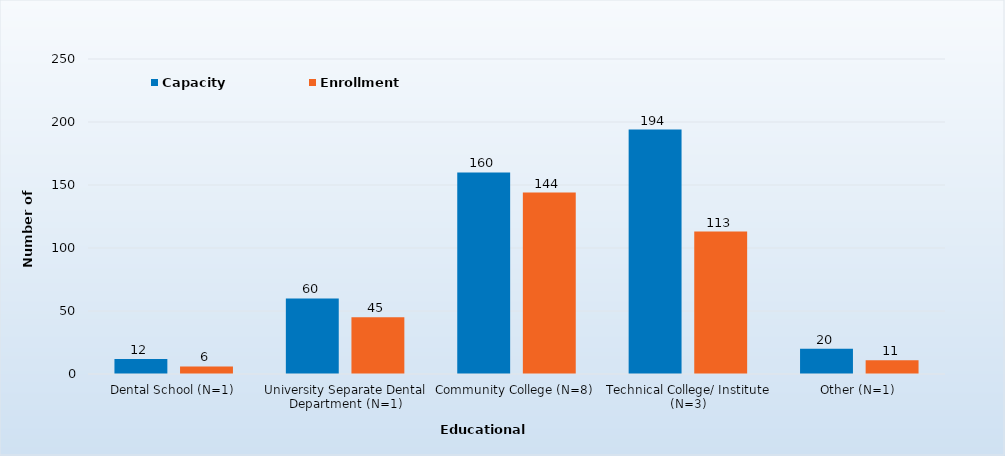
| Category | Capacity | Enrollment |
|---|---|---|
| Dental School (N=1) | 12 | 6 |
| University Separate Dental Department (N=1) | 60 | 45 |
| Community College (N=8) | 160 | 144 |
| Technical College/ Institute (N=3) | 194 | 113 |
| Other (N=1) | 20 | 11 |